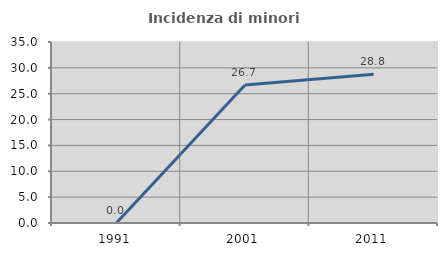
| Category | Incidenza di minori stranieri |
|---|---|
| 1991.0 | 0 |
| 2001.0 | 26.667 |
| 2011.0 | 28.767 |